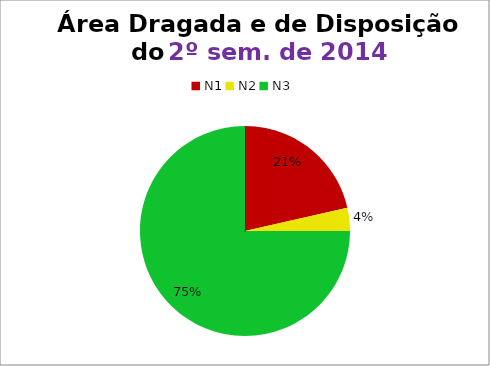
| Category | 2º/14 |
|---|---|
| N1 | 6 |
| N2 | 1 |
| N3 | 21 |